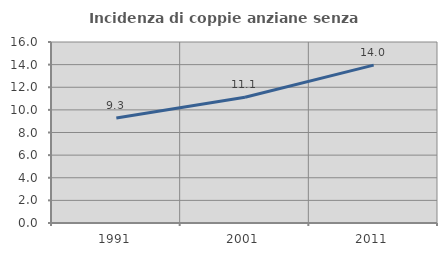
| Category | Incidenza di coppie anziane senza figli  |
|---|---|
| 1991.0 | 9.283 |
| 2001.0 | 11.12 |
| 2011.0 | 13.959 |